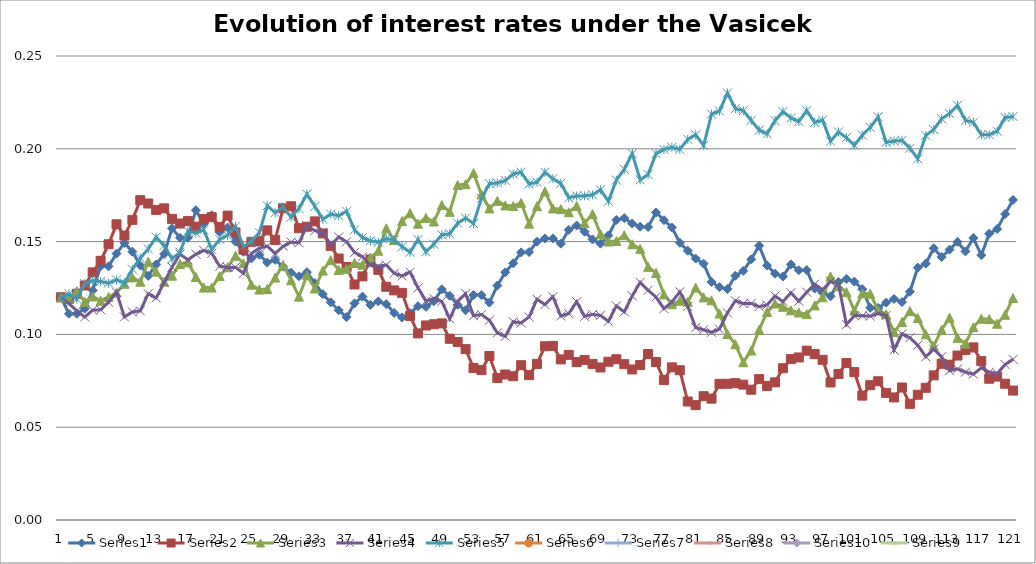
| Category | Series 0 | Series 1 | Series 2 | Series 3 | Series 4 | Series 5 | Series 6 | Series 7 | Series 9 | Series 8 |
|---|---|---|---|---|---|---|---|---|---|---|
| 0 | 0.12 | 0.12 | 0.12 | 0.12 | 0.12 |  |  |  |  |  |
| 1 | 0.111 | 0.119 | 0.12 | 0.117 | 0.122 |  |  |  |  |  |
| 2 | 0.111 | 0.122 | 0.123 | 0.113 | 0.119 |  |  |  |  |  |
| 3 | 0.114 | 0.126 | 0.118 | 0.109 | 0.127 |  |  |  |  |  |
| 4 | 0.124 | 0.133 | 0.12 | 0.113 | 0.129 |  |  |  |  |  |
| 5 | 0.137 | 0.14 | 0.118 | 0.113 | 0.129 |  |  |  |  |  |
| 6 | 0.137 | 0.149 | 0.12 | 0.117 | 0.128 |  |  |  |  |  |
| 7 | 0.144 | 0.159 | 0.123 | 0.123 | 0.129 |  |  |  |  |  |
| 8 | 0.149 | 0.153 | 0.127 | 0.109 | 0.128 |  |  |  |  |  |
| 9 | 0.145 | 0.162 | 0.131 | 0.112 | 0.135 |  |  |  |  |  |
| 10 | 0.137 | 0.172 | 0.128 | 0.113 | 0.141 |  |  |  |  |  |
| 11 | 0.132 | 0.171 | 0.139 | 0.122 | 0.146 |  |  |  |  |  |
| 12 | 0.138 | 0.167 | 0.134 | 0.12 | 0.152 |  |  |  |  |  |
| 13 | 0.143 | 0.168 | 0.128 | 0.128 | 0.148 |  |  |  |  |  |
| 14 | 0.157 | 0.162 | 0.132 | 0.136 | 0.141 |  |  |  |  |  |
| 15 | 0.152 | 0.16 | 0.138 | 0.143 | 0.144 |  |  |  |  |  |
| 16 | 0.152 | 0.161 | 0.139 | 0.14 | 0.156 |  |  |  |  |  |
| 17 | 0.167 | 0.158 | 0.131 | 0.143 | 0.155 |  |  |  |  |  |
| 18 | 0.16 | 0.162 | 0.125 | 0.145 | 0.156 |  |  |  |  |  |
| 19 | 0.164 | 0.163 | 0.125 | 0.144 | 0.146 |  |  |  |  |  |
| 20 | 0.155 | 0.158 | 0.131 | 0.137 | 0.151 |  |  |  |  |  |
| 21 | 0.158 | 0.164 | 0.136 | 0.136 | 0.153 |  |  |  |  |  |
| 22 | 0.15 | 0.155 | 0.142 | 0.136 | 0.158 |  |  |  |  |  |
| 23 | 0.145 | 0.146 | 0.138 | 0.133 | 0.147 |  |  |  |  |  |
| 24 | 0.141 | 0.15 | 0.127 | 0.144 | 0.15 |  |  |  |  |  |
| 25 | 0.143 | 0.15 | 0.124 | 0.146 | 0.155 |  |  |  |  |  |
| 26 | 0.139 | 0.156 | 0.124 | 0.148 | 0.169 |  |  |  |  |  |
| 27 | 0.14 | 0.151 | 0.131 | 0.144 | 0.166 |  |  |  |  |  |
| 28 | 0.136 | 0.168 | 0.137 | 0.148 | 0.169 |  |  |  |  |  |
| 29 | 0.133 | 0.169 | 0.129 | 0.15 | 0.163 |  |  |  |  |  |
| 30 | 0.131 | 0.157 | 0.12 | 0.149 | 0.168 |  |  |  |  |  |
| 31 | 0.134 | 0.158 | 0.132 | 0.158 | 0.176 |  |  |  |  |  |
| 32 | 0.128 | 0.161 | 0.125 | 0.156 | 0.169 |  |  |  |  |  |
| 33 | 0.122 | 0.154 | 0.134 | 0.155 | 0.162 |  |  |  |  |  |
| 34 | 0.117 | 0.148 | 0.14 | 0.148 | 0.165 |  |  |  |  |  |
| 35 | 0.113 | 0.141 | 0.135 | 0.152 | 0.164 |  |  |  |  |  |
| 36 | 0.109 | 0.136 | 0.135 | 0.15 | 0.166 |  |  |  |  |  |
| 37 | 0.117 | 0.127 | 0.138 | 0.144 | 0.156 |  |  |  |  |  |
| 38 | 0.12 | 0.131 | 0.138 | 0.142 | 0.152 |  |  |  |  |  |
| 39 | 0.116 | 0.14 | 0.141 | 0.137 | 0.15 |  |  |  |  |  |
| 40 | 0.118 | 0.135 | 0.145 | 0.137 | 0.15 |  |  |  |  |  |
| 41 | 0.116 | 0.126 | 0.157 | 0.137 | 0.152 |  |  |  |  |  |
| 42 | 0.112 | 0.124 | 0.151 | 0.133 | 0.151 |  |  |  |  |  |
| 43 | 0.109 | 0.122 | 0.161 | 0.132 | 0.147 |  |  |  |  |  |
| 44 | 0.111 | 0.11 | 0.165 | 0.134 | 0.144 |  |  |  |  |  |
| 45 | 0.115 | 0.101 | 0.16 | 0.125 | 0.151 |  |  |  |  |  |
| 46 | 0.115 | 0.105 | 0.163 | 0.118 | 0.145 |  |  |  |  |  |
| 47 | 0.118 | 0.105 | 0.161 | 0.119 | 0.149 |  |  |  |  |  |
| 48 | 0.124 | 0.106 | 0.17 | 0.118 | 0.154 |  |  |  |  |  |
| 49 | 0.121 | 0.098 | 0.166 | 0.108 | 0.154 |  |  |  |  |  |
| 50 | 0.116 | 0.096 | 0.18 | 0.118 | 0.16 |  |  |  |  |  |
| 51 | 0.113 | 0.092 | 0.181 | 0.122 | 0.163 |  |  |  |  |  |
| 52 | 0.121 | 0.082 | 0.187 | 0.11 | 0.16 |  |  |  |  |  |
| 53 | 0.121 | 0.081 | 0.175 | 0.111 | 0.173 |  |  |  |  |  |
| 54 | 0.117 | 0.088 | 0.168 | 0.108 | 0.181 |  |  |  |  |  |
| 55 | 0.126 | 0.077 | 0.172 | 0.101 | 0.182 |  |  |  |  |  |
| 56 | 0.133 | 0.078 | 0.17 | 0.099 | 0.183 |  |  |  |  |  |
| 57 | 0.138 | 0.077 | 0.169 | 0.107 | 0.186 |  |  |  |  |  |
| 58 | 0.144 | 0.083 | 0.171 | 0.106 | 0.187 |  |  |  |  |  |
| 59 | 0.144 | 0.078 | 0.16 | 0.109 | 0.181 |  |  |  |  |  |
| 60 | 0.15 | 0.084 | 0.169 | 0.119 | 0.182 |  |  |  |  |  |
| 61 | 0.152 | 0.094 | 0.177 | 0.116 | 0.187 |  |  |  |  |  |
| 62 | 0.152 | 0.094 | 0.168 | 0.12 | 0.184 |  |  |  |  |  |
| 63 | 0.149 | 0.087 | 0.167 | 0.11 | 0.181 |  |  |  |  |  |
| 64 | 0.156 | 0.089 | 0.166 | 0.111 | 0.174 |  |  |  |  |  |
| 65 | 0.159 | 0.085 | 0.169 | 0.118 | 0.175 |  |  |  |  |  |
| 66 | 0.155 | 0.086 | 0.16 | 0.11 | 0.175 |  |  |  |  |  |
| 67 | 0.151 | 0.084 | 0.165 | 0.111 | 0.175 |  |  |  |  |  |
| 68 | 0.149 | 0.082 | 0.154 | 0.11 | 0.178 |  |  |  |  |  |
| 69 | 0.153 | 0.085 | 0.15 | 0.107 | 0.172 |  |  |  |  |  |
| 70 | 0.162 | 0.087 | 0.15 | 0.115 | 0.183 |  |  |  |  |  |
| 71 | 0.163 | 0.084 | 0.153 | 0.112 | 0.189 |  |  |  |  |  |
| 72 | 0.16 | 0.081 | 0.149 | 0.121 | 0.197 |  |  |  |  |  |
| 73 | 0.158 | 0.083 | 0.146 | 0.128 | 0.183 |  |  |  |  |  |
| 74 | 0.158 | 0.089 | 0.136 | 0.124 | 0.186 |  |  |  |  |  |
| 75 | 0.166 | 0.085 | 0.133 | 0.12 | 0.197 |  |  |  |  |  |
| 76 | 0.162 | 0.075 | 0.122 | 0.114 | 0.2 |  |  |  |  |  |
| 77 | 0.158 | 0.082 | 0.116 | 0.117 | 0.201 |  |  |  |  |  |
| 78 | 0.149 | 0.081 | 0.118 | 0.123 | 0.2 |  |  |  |  |  |
| 79 | 0.145 | 0.064 | 0.118 | 0.115 | 0.205 |  |  |  |  |  |
| 80 | 0.141 | 0.062 | 0.125 | 0.104 | 0.208 |  |  |  |  |  |
| 81 | 0.138 | 0.067 | 0.12 | 0.102 | 0.202 |  |  |  |  |  |
| 82 | 0.128 | 0.065 | 0.118 | 0.101 | 0.219 |  |  |  |  |  |
| 83 | 0.125 | 0.073 | 0.111 | 0.103 | 0.22 |  |  |  |  |  |
| 84 | 0.124 | 0.073 | 0.1 | 0.112 | 0.23 |  |  |  |  |  |
| 85 | 0.132 | 0.074 | 0.095 | 0.118 | 0.222 |  |  |  |  |  |
| 86 | 0.134 | 0.073 | 0.085 | 0.117 | 0.221 |  |  |  |  |  |
| 87 | 0.14 | 0.07 | 0.091 | 0.117 | 0.215 |  |  |  |  |  |
| 88 | 0.148 | 0.076 | 0.102 | 0.115 | 0.21 |  |  |  |  |  |
| 89 | 0.137 | 0.072 | 0.112 | 0.116 | 0.208 |  |  |  |  |  |
| 90 | 0.133 | 0.074 | 0.117 | 0.121 | 0.215 |  |  |  |  |  |
| 91 | 0.131 | 0.082 | 0.115 | 0.118 | 0.22 |  |  |  |  |  |
| 92 | 0.138 | 0.087 | 0.113 | 0.122 | 0.217 |  |  |  |  |  |
| 93 | 0.135 | 0.088 | 0.112 | 0.118 | 0.215 |  |  |  |  |  |
| 94 | 0.135 | 0.091 | 0.111 | 0.123 | 0.221 |  |  |  |  |  |
| 95 | 0.125 | 0.089 | 0.116 | 0.127 | 0.214 |  |  |  |  |  |
| 96 | 0.123 | 0.086 | 0.12 | 0.124 | 0.215 |  |  |  |  |  |
| 97 | 0.121 | 0.074 | 0.131 | 0.128 | 0.204 |  |  |  |  |  |
| 98 | 0.128 | 0.079 | 0.126 | 0.127 | 0.209 |  |  |  |  |  |
| 99 | 0.13 | 0.085 | 0.123 | 0.105 | 0.206 |  |  |  |  |  |
| 100 | 0.128 | 0.08 | 0.113 | 0.11 | 0.202 |  |  |  |  |  |
| 101 | 0.124 | 0.067 | 0.122 | 0.11 | 0.207 |  |  |  |  |  |
| 102 | 0.114 | 0.073 | 0.122 | 0.11 | 0.212 |  |  |  |  |  |
| 103 | 0.114 | 0.075 | 0.113 | 0.111 | 0.217 |  |  |  |  |  |
| 104 | 0.117 | 0.068 | 0.111 | 0.11 | 0.203 |  |  |  |  |  |
| 105 | 0.119 | 0.066 | 0.101 | 0.092 | 0.204 |  |  |  |  |  |
| 106 | 0.117 | 0.071 | 0.107 | 0.1 | 0.205 |  |  |  |  |  |
| 107 | 0.123 | 0.063 | 0.113 | 0.098 | 0.2 |  |  |  |  |  |
| 108 | 0.136 | 0.067 | 0.109 | 0.094 | 0.195 |  |  |  |  |  |
| 109 | 0.138 | 0.071 | 0.1 | 0.088 | 0.207 |  |  |  |  |  |
| 110 | 0.146 | 0.078 | 0.094 | 0.092 | 0.21 |  |  |  |  |  |
| 111 | 0.142 | 0.084 | 0.102 | 0.088 | 0.216 |  |  |  |  |  |
| 112 | 0.146 | 0.084 | 0.109 | 0.08 | 0.219 |  |  |  |  |  |
| 113 | 0.15 | 0.089 | 0.098 | 0.081 | 0.223 |  |  |  |  |  |
| 114 | 0.145 | 0.092 | 0.095 | 0.08 | 0.215 |  |  |  |  |  |
| 115 | 0.152 | 0.093 | 0.104 | 0.079 | 0.214 |  |  |  |  |  |
| 116 | 0.143 | 0.086 | 0.108 | 0.082 | 0.208 |  |  |  |  |  |
| 117 | 0.154 | 0.076 | 0.108 | 0.08 | 0.208 |  |  |  |  |  |
| 118 | 0.157 | 0.077 | 0.106 | 0.079 | 0.209 |  |  |  |  |  |
| 119 | 0.165 | 0.073 | 0.111 | 0.084 | 0.217 |  |  |  |  |  |
| 120 | 0.172 | 0.07 | 0.12 | 0.087 | 0.217 |  |  |  |  |  |